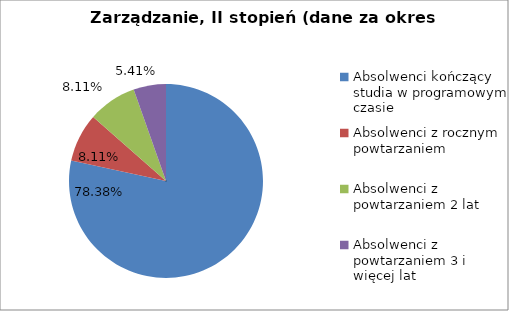
| Category | Series 0 |
|---|---|
| Absolwenci kończący studia w programowym czasie | 78.378 |
| Absolwenci z rocznym powtarzaniem | 8.108 |
| Absolwenci z powtarzaniem 2 lat | 8.108 |
| Absolwenci z powtarzaniem 3 i więcej lat | 5.405 |